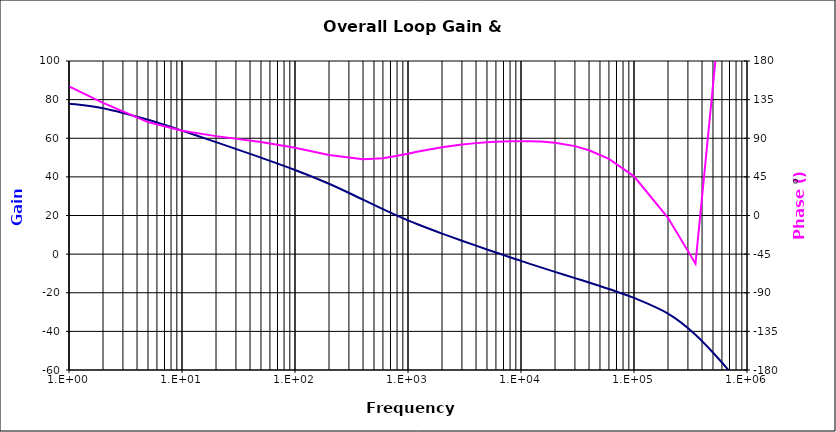
| Category | Gain |
|---|---|
| 1.0 | 77.908 |
| 2.0 | 75.537 |
| 5.0 | 69.576 |
| 10.0 | 63.931 |
| 20.0 | 57.994 |
| 50.0 | 49.956 |
| 100.0 | 43.583 |
| 200.0 | 36.46 |
| 400.0 | 28.234 |
| 600.0 | 23.287 |
| 800.0 | 19.951 |
| 1000.0 | 17.509 |
| 1200.0 | 15.607 |
| 1500.0 | 13.381 |
| 2000.0 | 10.638 |
| 3000.0 | 6.936 |
| 4000.0 | 4.381 |
| 5000.0 | 2.427 |
| 6000.0 | 0.846 |
| 7000.0 | -0.48 |
| 8000.0 | -1.621 |
| 9000.0 | -2.621 |
| 10000.0 | -3.509 |
| 12000.0 | -5.031 |
| 15000.0 | -6.867 |
| 20000.0 | -9.19 |
| 30000.0 | -12.412 |
| 40000.0 | -14.715 |
| 60000.0 | -18.079 |
| 100000.0 | -22.687 |
| 200000.0 | -30.835 |
| 350000.0 | -41.704 |
| 600000.0 | -56.108 |
| 1000000.0 | -71.882 |